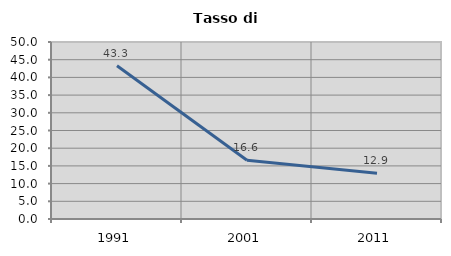
| Category | Tasso di disoccupazione   |
|---|---|
| 1991.0 | 43.276 |
| 2001.0 | 16.603 |
| 2011.0 | 12.914 |